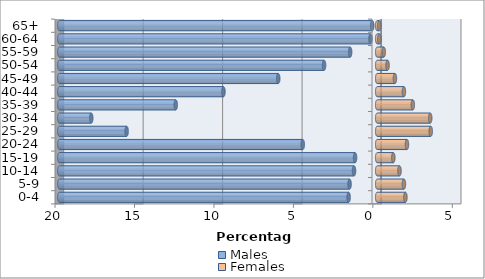
| Category | Males | Females |
|---|---|---|
| 0-4 | -1.799 | 1.775 |
| 5-9 | -1.739 | 1.681 |
| 10-14 | -1.458 | 1.402 |
| 15-19 | -1.393 | 1.014 |
| 20-24 | -4.685 | 1.872 |
| 25-29 | -15.767 | 3.368 |
| 30-34 | -17.993 | 3.337 |
| 35-39 | -12.677 | 2.241 |
| 40-44 | -9.674 | 1.68 |
| 45-49 | -6.227 | 1.115 |
| 50-54 | -3.343 | 0.652 |
| 55-59 | -1.702 | 0.411 |
| 60-64 | -0.421 | 0.133 |
| 65+ | -0.314 | 0.128 |